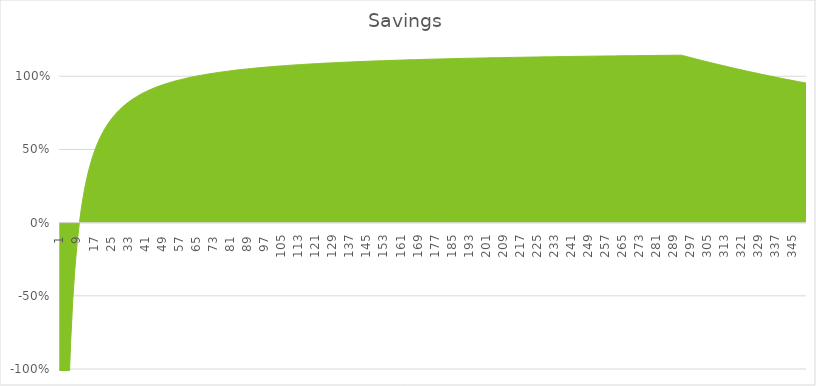
| Category | Savings |
|---|---|
| 1.0 | -10.815 |
| 2.0 | -4.815 |
| 3.0 | -2.815 |
| 4.0 | -1.815 |
| 5.0 | -1.215 |
| 6.0 | -0.815 |
| 7.0 | -0.529 |
| 8.0 | -0.315 |
| 9.0 | -0.148 |
| 10.0 | -0.015 |
| 11.0 | 0.094 |
| 12.0 | 0.185 |
| 13.0 | 0.262 |
| 14.0 | 0.328 |
| 15.0 | 0.385 |
| 16.0 | 0.435 |
| 17.0 | 0.479 |
| 18.0 | 0.518 |
| 19.0 | 0.554 |
| 20.0 | 0.585 |
| 21.0 | 0.614 |
| 22.0 | 0.64 |
| 23.0 | 0.663 |
| 24.0 | 0.685 |
| 25.0 | 0.705 |
| 26.0 | 0.724 |
| 27.0 | 0.741 |
| 28.0 | 0.757 |
| 29.0 | 0.771 |
| 30.0 | 0.785 |
| 31.0 | 0.798 |
| 32.0 | 0.81 |
| 33.0 | 0.822 |
| 34.0 | 0.832 |
| 35.0 | 0.842 |
| 36.0 | 0.852 |
| 37.0 | 0.861 |
| 38.0 | 0.869 |
| 39.0 | 0.877 |
| 40.0 | 0.885 |
| 41.0 | 0.892 |
| 42.0 | 0.899 |
| 43.0 | 0.906 |
| 44.0 | 0.912 |
| 45.0 | 0.918 |
| 46.0 | 0.924 |
| 47.0 | 0.93 |
| 48.0 | 0.935 |
| 49.0 | 0.94 |
| 50.0 | 0.945 |
| 51.0 | 0.95 |
| 52.0 | 0.954 |
| 53.0 | 0.959 |
| 54.0 | 0.963 |
| 55.0 | 0.967 |
| 56.0 | 0.971 |
| 57.0 | 0.975 |
| 58.0 | 0.978 |
| 59.0 | 0.982 |
| 60.0 | 0.985 |
| 61.0 | 0.988 |
| 62.0 | 0.992 |
| 63.0 | 0.995 |
| 64.0 | 0.998 |
| 65.0 | 1.001 |
| 66.0 | 1.003 |
| 67.0 | 1.006 |
| 68.0 | 1.009 |
| 69.0 | 1.011 |
| 70.0 | 1.014 |
| 71.0 | 1.016 |
| 72.0 | 1.018 |
| 73.0 | 1.021 |
| 74.0 | 1.023 |
| 75.0 | 1.025 |
| 76.0 | 1.027 |
| 77.0 | 1.029 |
| 78.0 | 1.031 |
| 79.0 | 1.033 |
| 80.0 | 1.035 |
| 81.0 | 1.037 |
| 82.0 | 1.039 |
| 83.0 | 1.041 |
| 84.0 | 1.042 |
| 85.0 | 1.044 |
| 86.0 | 1.046 |
| 87.0 | 1.047 |
| 88.0 | 1.049 |
| 89.0 | 1.05 |
| 90.0 | 1.052 |
| 91.0 | 1.053 |
| 92.0 | 1.055 |
| 93.0 | 1.056 |
| 94.0 | 1.058 |
| 95.0 | 1.059 |
| 96.0 | 1.06 |
| 97.0 | 1.061 |
| 98.0 | 1.063 |
| 99.0 | 1.064 |
| 100.0 | 1.065 |
| 101.0 | 1.066 |
| 102.0 | 1.068 |
| 103.0 | 1.069 |
| 104.0 | 1.07 |
| 105.0 | 1.071 |
| 106.0 | 1.072 |
| 107.0 | 1.073 |
| 108.0 | 1.074 |
| 109.0 | 1.075 |
| 110.0 | 1.076 |
| 111.0 | 1.077 |
| 112.0 | 1.078 |
| 113.0 | 1.079 |
| 114.0 | 1.08 |
| 115.0 | 1.081 |
| 116.0 | 1.082 |
| 117.0 | 1.083 |
| 118.0 | 1.083 |
| 119.0 | 1.084 |
| 120.0 | 1.085 |
| 121.0 | 1.086 |
| 122.0 | 1.087 |
| 123.0 | 1.088 |
| 124.0 | 1.088 |
| 125.0 | 1.089 |
| 126.0 | 1.09 |
| 127.0 | 1.091 |
| 128.0 | 1.091 |
| 129.0 | 1.092 |
| 130.0 | 1.093 |
| 131.0 | 1.094 |
| 132.0 | 1.094 |
| 133.0 | 1.095 |
| 134.0 | 1.096 |
| 135.0 | 1.096 |
| 136.0 | 1.097 |
| 137.0 | 1.098 |
| 138.0 | 1.098 |
| 139.0 | 1.099 |
| 140.0 | 1.099 |
| 141.0 | 1.1 |
| 142.0 | 1.101 |
| 143.0 | 1.101 |
| 144.0 | 1.102 |
| 145.0 | 1.102 |
| 146.0 | 1.103 |
| 147.0 | 1.104 |
| 148.0 | 1.104 |
| 149.0 | 1.105 |
| 150.0 | 1.105 |
| 151.0 | 1.106 |
| 152.0 | 1.106 |
| 153.0 | 1.107 |
| 154.0 | 1.107 |
| 155.0 | 1.108 |
| 156.0 | 1.108 |
| 157.0 | 1.109 |
| 158.0 | 1.109 |
| 159.0 | 1.11 |
| 160.0 | 1.11 |
| 161.0 | 1.111 |
| 162.0 | 1.111 |
| 163.0 | 1.112 |
| 164.0 | 1.112 |
| 165.0 | 1.112 |
| 166.0 | 1.113 |
| 167.0 | 1.113 |
| 168.0 | 1.114 |
| 169.0 | 1.114 |
| 170.0 | 1.115 |
| 171.0 | 1.115 |
| 172.0 | 1.115 |
| 173.0 | 1.116 |
| 174.0 | 1.116 |
| 175.0 | 1.117 |
| 176.0 | 1.117 |
| 177.0 | 1.117 |
| 178.0 | 1.118 |
| 179.0 | 1.118 |
| 180.0 | 1.118 |
| 181.0 | 1.119 |
| 182.0 | 1.119 |
| 183.0 | 1.12 |
| 184.0 | 1.12 |
| 185.0 | 1.12 |
| 186.0 | 1.121 |
| 187.0 | 1.121 |
| 188.0 | 1.121 |
| 189.0 | 1.122 |
| 190.0 | 1.122 |
| 191.0 | 1.122 |
| 192.0 | 1.123 |
| 193.0 | 1.123 |
| 194.0 | 1.123 |
| 195.0 | 1.124 |
| 196.0 | 1.124 |
| 197.0 | 1.124 |
| 198.0 | 1.125 |
| 199.0 | 1.125 |
| 200.0 | 1.125 |
| 201.0 | 1.125 |
| 202.0 | 1.126 |
| 203.0 | 1.126 |
| 204.0 | 1.126 |
| 205.0 | 1.127 |
| 206.0 | 1.127 |
| 207.0 | 1.127 |
| 208.0 | 1.127 |
| 209.0 | 1.128 |
| 210.0 | 1.128 |
| 211.0 | 1.128 |
| 212.0 | 1.129 |
| 213.0 | 1.129 |
| 214.0 | 1.129 |
| 215.0 | 1.129 |
| 216.0 | 1.13 |
| 217.0 | 1.13 |
| 218.0 | 1.13 |
| 219.0 | 1.13 |
| 220.0 | 1.131 |
| 221.0 | 1.131 |
| 222.0 | 1.131 |
| 223.0 | 1.131 |
| 224.0 | 1.132 |
| 225.0 | 1.132 |
| 226.0 | 1.132 |
| 227.0 | 1.132 |
| 228.0 | 1.133 |
| 229.0 | 1.133 |
| 230.0 | 1.133 |
| 231.0 | 1.133 |
| 232.0 | 1.133 |
| 233.0 | 1.134 |
| 234.0 | 1.134 |
| 235.0 | 1.134 |
| 236.0 | 1.134 |
| 237.0 | 1.135 |
| 238.0 | 1.135 |
| 239.0 | 1.135 |
| 240.0 | 1.135 |
| 241.0 | 1.135 |
| 242.0 | 1.136 |
| 243.0 | 1.136 |
| 244.0 | 1.136 |
| 245.0 | 1.136 |
| 246.0 | 1.136 |
| 247.0 | 1.137 |
| 248.0 | 1.137 |
| 249.0 | 1.137 |
| 250.0 | 1.137 |
| 251.0 | 1.137 |
| 252.0 | 1.138 |
| 253.0 | 1.138 |
| 254.0 | 1.138 |
| 255.0 | 1.138 |
| 256.0 | 1.138 |
| 257.0 | 1.138 |
| 258.0 | 1.139 |
| 259.0 | 1.139 |
| 260.0 | 1.139 |
| 261.0 | 1.139 |
| 262.0 | 1.139 |
| 263.0 | 1.14 |
| 264.0 | 1.14 |
| 265.0 | 1.14 |
| 266.0 | 1.14 |
| 267.0 | 1.14 |
| 268.0 | 1.14 |
| 269.0 | 1.141 |
| 270.0 | 1.141 |
| 271.0 | 1.141 |
| 272.0 | 1.141 |
| 273.0 | 1.141 |
| 274.0 | 1.141 |
| 275.0 | 1.142 |
| 276.0 | 1.142 |
| 277.0 | 1.142 |
| 278.0 | 1.142 |
| 279.0 | 1.142 |
| 280.0 | 1.142 |
| 281.0 | 1.142 |
| 282.0 | 1.143 |
| 283.0 | 1.143 |
| 284.0 | 1.143 |
| 285.0 | 1.143 |
| 286.0 | 1.143 |
| 287.0 | 1.143 |
| 288.0 | 1.143 |
| 289.0 | 1.144 |
| 290.0 | 1.144 |
| 291.0 | 1.144 |
| 292.0 | 1.144 |
| 293.0 | 1.144 |
| 294.0 | 1.14 |
| 295.0 | 1.136 |
| 296.0 | 1.133 |
| 297.0 | 1.129 |
| 298.0 | 1.125 |
| 299.0 | 1.121 |
| 300.0 | 1.118 |
| 301.0 | 1.114 |
| 302.0 | 1.11 |
| 303.0 | 1.106 |
| 304.0 | 1.103 |
| 305.0 | 1.099 |
| 306.0 | 1.096 |
| 307.0 | 1.092 |
| 308.0 | 1.088 |
| 309.0 | 1.085 |
| 310.0 | 1.081 |
| 311.0 | 1.078 |
| 312.0 | 1.075 |
| 313.0 | 1.071 |
| 314.0 | 1.068 |
| 315.0 | 1.064 |
| 316.0 | 1.061 |
| 317.0 | 1.058 |
| 318.0 | 1.054 |
| 319.0 | 1.051 |
| 320.0 | 1.048 |
| 321.0 | 1.044 |
| 322.0 | 1.041 |
| 323.0 | 1.038 |
| 324.0 | 1.035 |
| 325.0 | 1.032 |
| 326.0 | 1.028 |
| 327.0 | 1.025 |
| 328.0 | 1.022 |
| 329.0 | 1.019 |
| 330.0 | 1.016 |
| 331.0 | 1.013 |
| 332.0 | 1.01 |
| 333.0 | 1.007 |
| 334.0 | 1.004 |
| 335.0 | 1.001 |
| 336.0 | 0.998 |
| 337.0 | 0.995 |
| 338.0 | 0.992 |
| 339.0 | 0.989 |
| 340.0 | 0.986 |
| 341.0 | 0.983 |
| 342.0 | 0.98 |
| 343.0 | 0.977 |
| 344.0 | 0.975 |
| 345.0 | 0.972 |
| 346.0 | 0.969 |
| 347.0 | 0.966 |
| 348.0 | 0.963 |
| 349.0 | 0.961 |
| 350.0 | 0.958 |
| 351.0 | 0.955 |
| 352.0 | 0.952 |